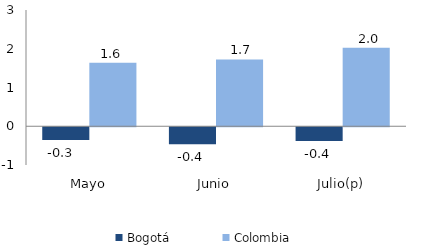
| Category | Bogotá | Colombia |
|---|---|---|
| Mayo | -0.326 | 1.639 |
| Junio | -0.438 | 1.724 |
| Julio(p) | -0.355 | 2.025 |